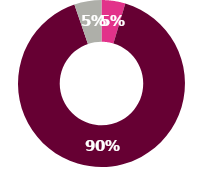
| Category | Series 0 |
|---|---|
| 0 | 7 |
| 1 | 137 |
| 2 | 8 |